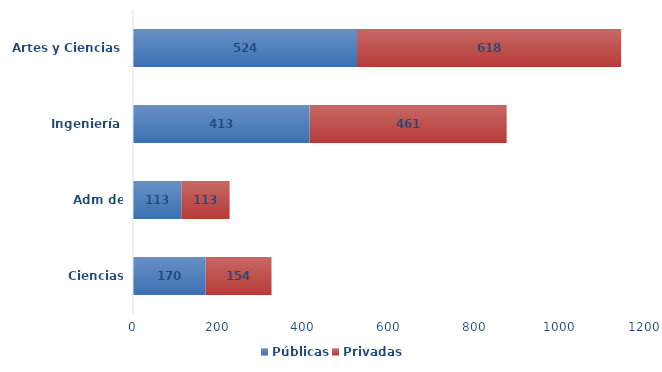
| Category | Públicas | Privadas |
|---|---|---|
| Ciencias Agrícolas | 170 | 154 |
| Adm de Empresas | 113 | 113 |
| Ingeniería | 413 | 461 |
| Artes y Ciencias | 524 | 618 |